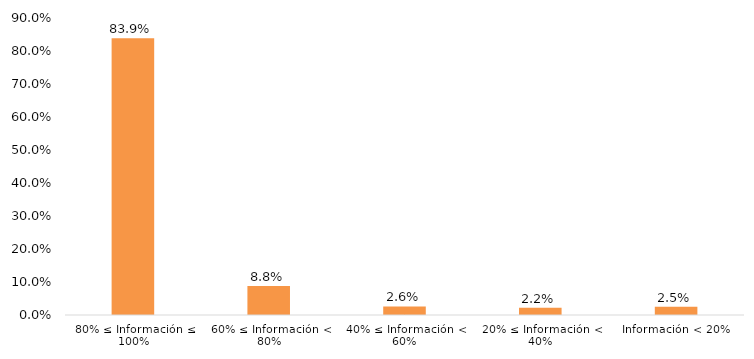
| Category | Series 0 |
|---|---|
| 0 | 0.839 |
| 1 | 0.088 |
| 2 | 0.026 |
| 3 | 0.022 |
| 4 | 0.025 |